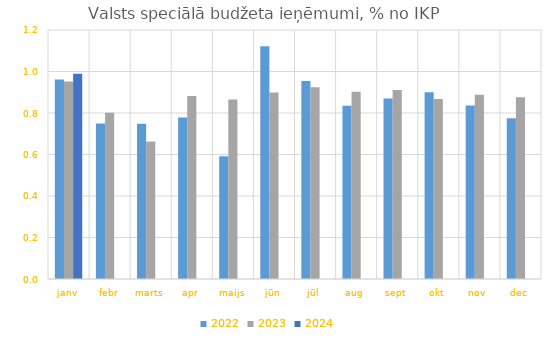
| Category | 2022 | 2023 | 2024 |
|---|---|---|---|
| janv | 0.962 | 0.951 | 0.99 |
| febr | 0.749 | 0.801 | 0 |
| marts | 0.748 | 0.663 | 0 |
| apr | 0.778 | 0.882 | 0 |
| maijs | 0.591 | 0.866 | 0 |
| jūn | 1.122 | 0.899 | 0 |
| jūl | 0.954 | 0.924 | 0 |
| aug | 0.835 | 0.902 | 0 |
| sept | 0.869 | 0.91 | 0 |
| okt | 0.9 | 0.867 | 0 |
| nov | 0.836 | 0.888 | 0 |
| dec | 0.774 | 0.876 | 0 |